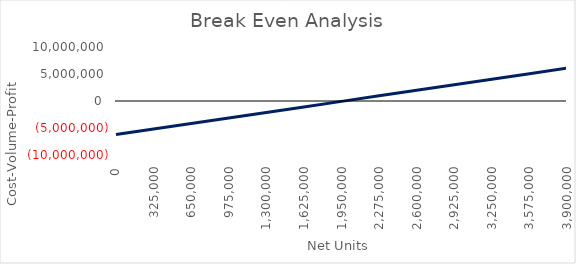
| Category | Net Profit  |
|---|---|
| 0.0 | -6210000 |
| 325000.0 | -5186250 |
| 650000.0 | -4162500 |
| 975000.0 | -3138750 |
| 1300000.0 | -2115000 |
| 1625000.0 | -1091250 |
| 1950000.0 | -67500 |
| 2275000.0 | 956250 |
| 2600000.0 | 1980000 |
| 2925000.0 | 3003750 |
| 3250000.0 | 4027500 |
| 3575000.0 | 5051250 |
| 3900000.0 | 6075000 |